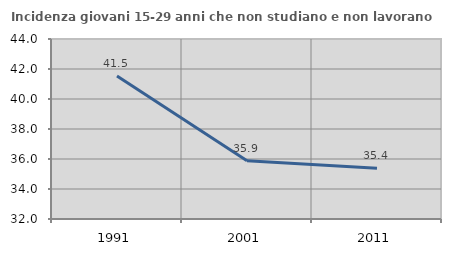
| Category | Incidenza giovani 15-29 anni che non studiano e non lavorano  |
|---|---|
| 1991.0 | 41.532 |
| 2001.0 | 35.886 |
| 2011.0 | 35.385 |